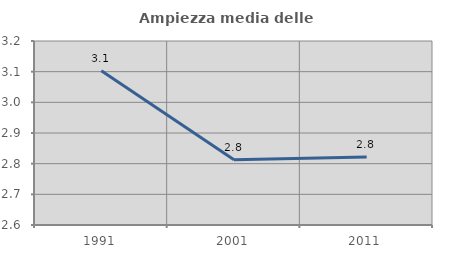
| Category | Ampiezza media delle famiglie |
|---|---|
| 1991.0 | 3.103 |
| 2001.0 | 2.813 |
| 2011.0 | 2.821 |